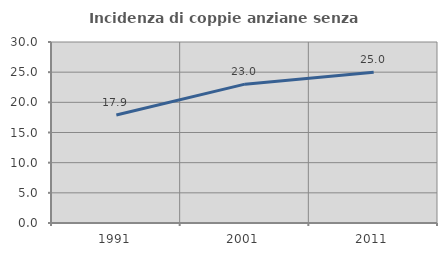
| Category | Incidenza di coppie anziane senza figli  |
|---|---|
| 1991.0 | 17.91 |
| 2001.0 | 23.016 |
| 2011.0 | 25 |